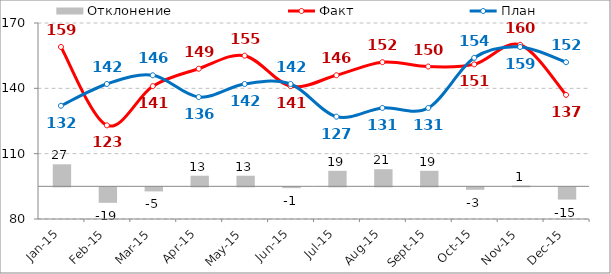
| Category | Отклонение |
|---|---|
| 2015-01-01 | 27 |
| 2015-02-01 | -19 |
| 2015-03-01 | -5 |
| 2015-04-01 | 13 |
| 2015-05-01 | 13 |
| 2015-06-01 | -1 |
| 2015-07-01 | 19 |
| 2015-08-01 | 21 |
| 2015-09-01 | 19 |
| 2015-10-01 | -3 |
| 2015-11-01 | 1 |
| 2015-12-01 | -15 |